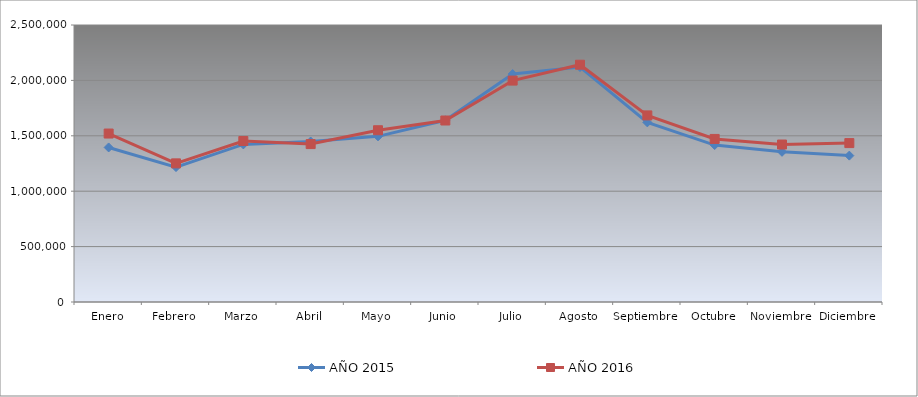
| Category | AÑO 2015 | AÑO 2016 |
|---|---|---|
| Enero | 1394950 | 1520375 |
| Febrero | 1217630 | 1251175 |
| Marzo | 1422210 | 1453280 |
| Abril | 1448430 | 1425150 |
| Mayo | 1495040 | 1550270 |
| Junio | 1640250 | 1638000 |
| Julio | 2057070 | 1998270 |
| Agosto | 2120500 | 2141540 |
| Septiembre | 1621300 | 1684000 |
| Octubre | 1416460 | 1471810 |
| Noviembre | 1355360 | 1421240 |
| Diciembre | 1321190 | 1434310 |